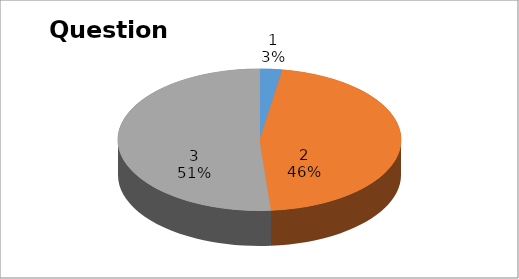
| Category | Series 0 |
|---|---|
| 0 | 1 |
| 1 | 18 |
| 2 | 20 |